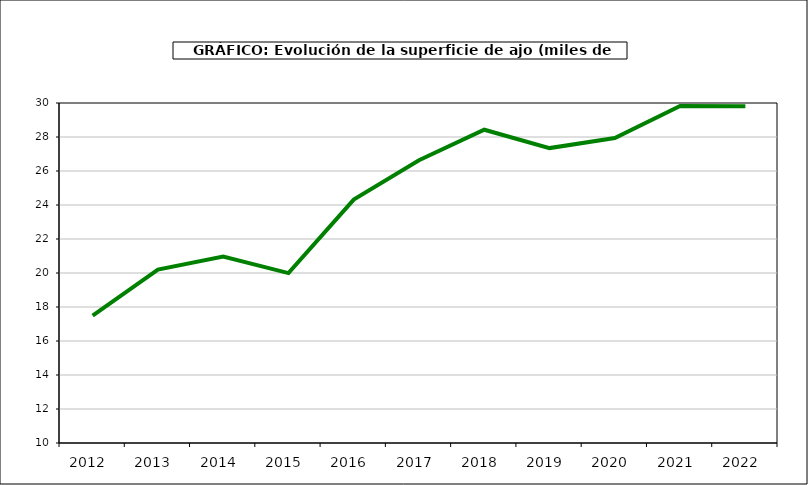
| Category | superficie |
|---|---|
| 2012.0 | 17.494 |
| 2013.0 | 20.197 |
| 2014.0 | 20.965 |
| 2015.0 | 19.996 |
| 2016.0 | 24.317 |
| 2017.0 | 26.63 |
| 2018.0 | 28.428 |
| 2019.0 | 27.348 |
| 2020.0 | 27.937 |
| 2021.0 | 29.826 |
| 2022.0 | 29.802 |